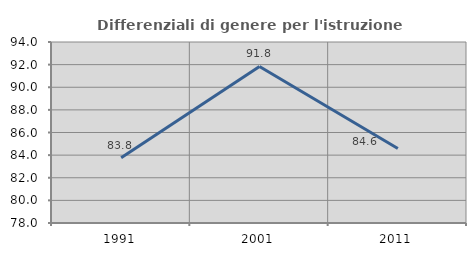
| Category | Differenziali di genere per l'istruzione superiore |
|---|---|
| 1991.0 | 83.772 |
| 2001.0 | 91.834 |
| 2011.0 | 84.584 |